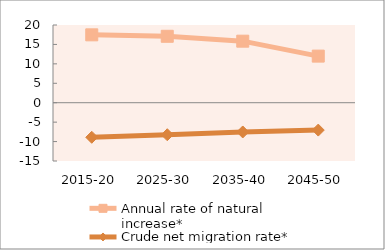
| Category | Annual rate of natural increase* | Crude net migration rate* |
|---|---|---|
| 2015-20 | 17.47 | -8.892 |
| 2025-30 | 17.093 | -8.242 |
| 2035-40 | 15.838 | -7.531 |
| 2045-50 | 11.993 | -7.046 |